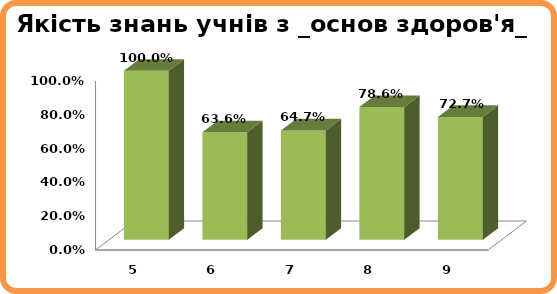
| Category | Series 0 |
|---|---|
| 5.0 | 1 |
| 6.0 | 0.636 |
| 7.0 | 0.647 |
| 8.0 | 0.786 |
| 9.0 | 0.727 |